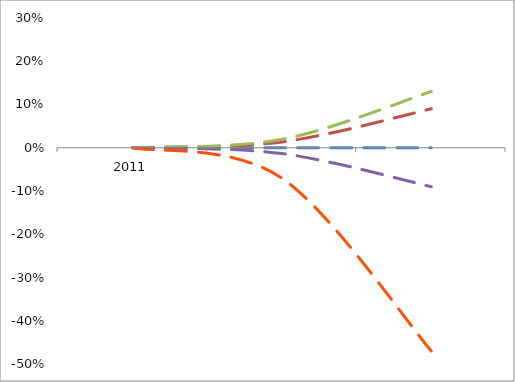
| Category | Series 0 | Series 1 | Series 2 | Series 3 | Series 4 |
|---|---|---|---|---|---|
| 0 | 0 | 0 | 0 | 0 | 0 |
| 1 | 0 | 0.014 | 0.019 | -0.013 | -0.07 |
| 2 | 0 | 0.09 | 0.13 | -0.09 | -0.47 |